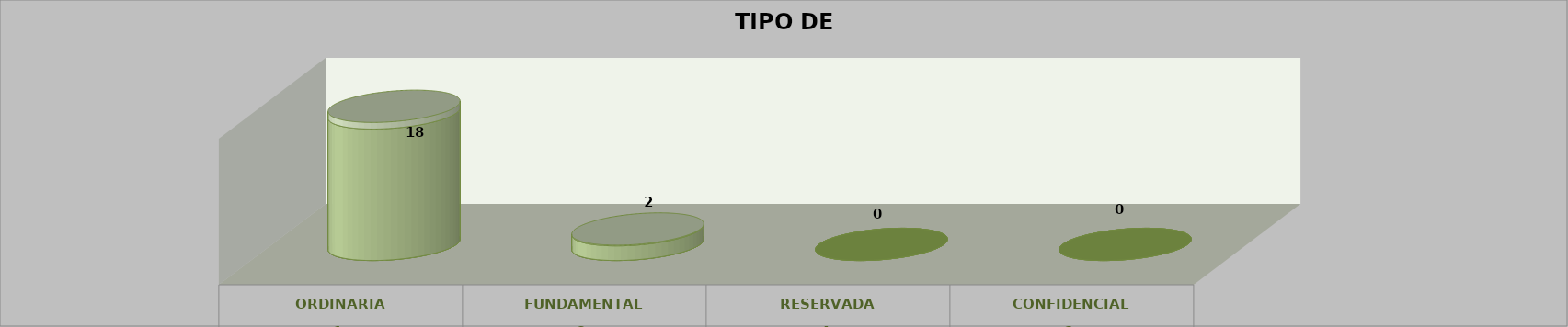
| Category | Series 0 | Series 2 | Series 1 | Series 3 | Series 4 |
|---|---|---|---|---|---|
| 0 |  |  |  | 18 | 0.9 |
| 1 |  |  |  | 2 | 0.1 |
| 2 |  |  |  | 0 | 0 |
| 3 |  |  |  | 0 | 0 |